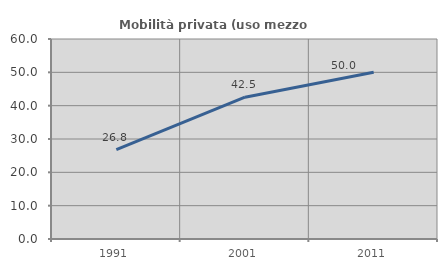
| Category | Mobilità privata (uso mezzo privato) |
|---|---|
| 1991.0 | 26.786 |
| 2001.0 | 42.537 |
| 2011.0 | 50 |